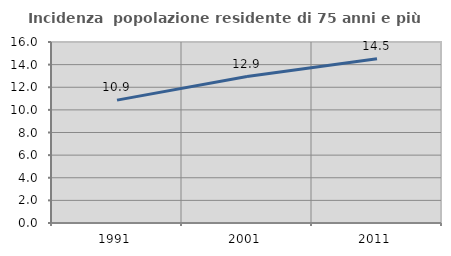
| Category | Incidenza  popolazione residente di 75 anni e più |
|---|---|
| 1991.0 | 10.86 |
| 2001.0 | 12.942 |
| 2011.0 | 14.519 |